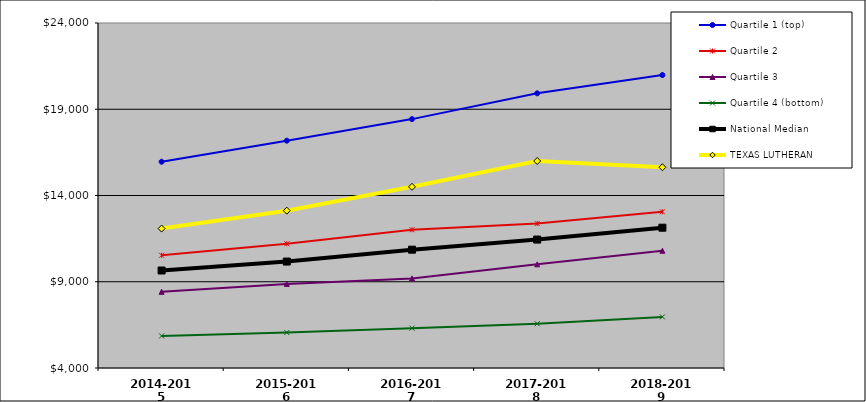
| Category | Quartile 1 (top) | Quartile 2 | Quartile 3 | Quartile 4 (bottom) | National Median | TEXAS LUTHERAN |
|---|---|---|---|---|---|---|
| 2014-2015 | 15957.781 | 10533.772 | 8416.461 | 5859.936 | 9651.331 | 12082.598 |
| 2015-2016 | 17178.182 | 11202.658 | 8871.513 | 6055.684 | 10170.953 | 13120.524 |
| 2016-2017 | 18428.39 | 12017.087 | 9194.437 | 6310.646 | 10859.41 | 14503.602 |
| 2017-2018 | 19922.29 | 12374.126 | 10010.579 | 6566.774 | 11445.61 | 15999.237 |
| 2018-2019 | 20983.29 | 13054.75 | 10797.607 | 6962.909 | 12133.725 | 15639.308 |